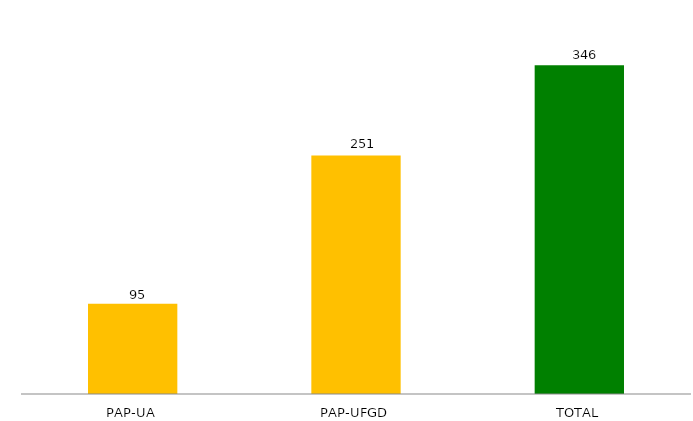
| Category | Series 1 |
|---|---|
| PAP-UA | 95 |
| PAP-UFGD | 251 |
| TOTAL | 346 |